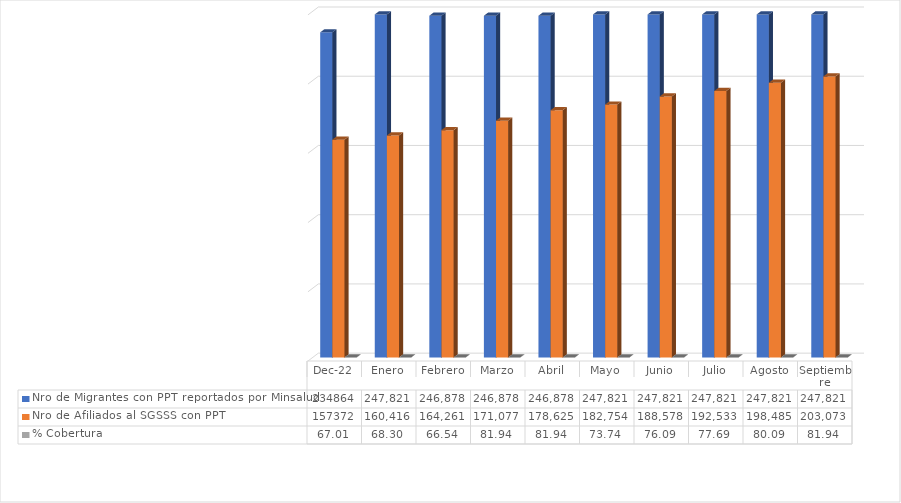
| Category | Nro de Migrantes con PPT reportados por Minsalud  | Nro de Afiliados al SGSSS con PPT | % Cobertura |
|---|---|---|---|
| dic-22 | 234864 | 157372 | 67.006 |
| Enero | 247821 | 160416 | 68.302 |
| Febrero | 246878 | 164261 | 66.535 |
| Marzo | 246878 | 171077 | 81.943 |
| Abril | 246878 | 178625 | 81.943 |
| Mayo | 247821 | 182754 | 73.744 |
| Junio | 247821 | 188578 | 76.094 |
| Julio | 247821 | 192533 | 77.69 |
| Agosto | 247821 | 198485 | 80.092 |
| Septiembre | 247821 | 203073 | 81.943 |